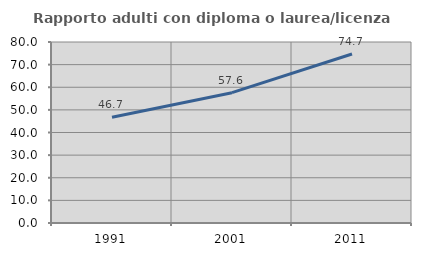
| Category | Rapporto adulti con diploma o laurea/licenza media  |
|---|---|
| 1991.0 | 46.734 |
| 2001.0 | 57.6 |
| 2011.0 | 74.689 |